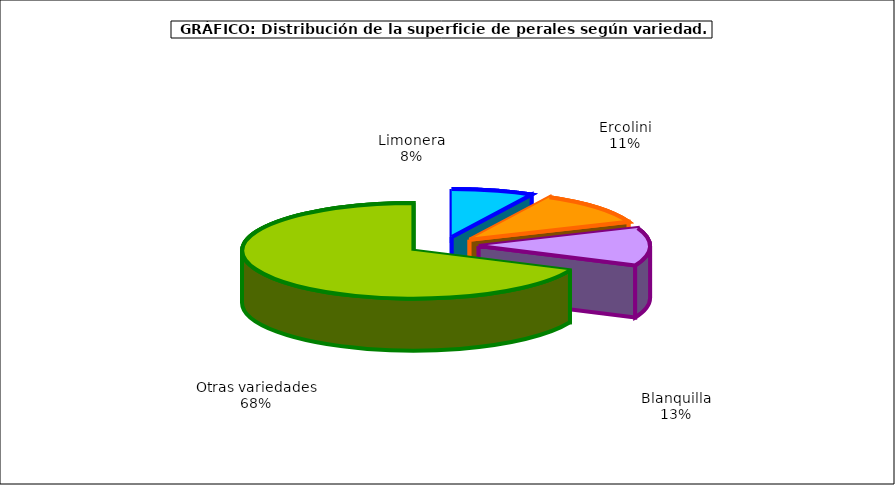
| Category | superficie |
|---|---|
| 0 | 1.592 |
| 1 | 2.306 |
| 2 | 2.636 |
| 3 | 14.089 |